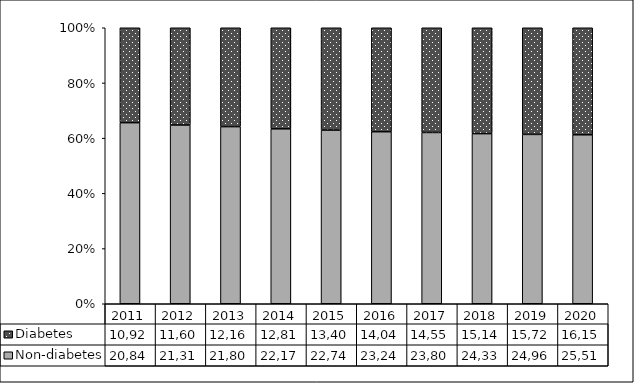
| Category | Non-diabetes | Diabetes |
|---|---|---|
| 2011 | 20848 | 10928 |
| 2012 | 21318 | 11600 |
| 2013 | 21800 | 12167 |
| 2014 | 22170 | 12810 |
| 2015 | 22746 | 13406 |
| 2016 | 23246 | 14047 |
| 2017 | 23809 | 14556 |
| 2018 | 24335 | 15146 |
| 2019 | 24969 | 15724 |
| 2020 | 25511 | 16159 |